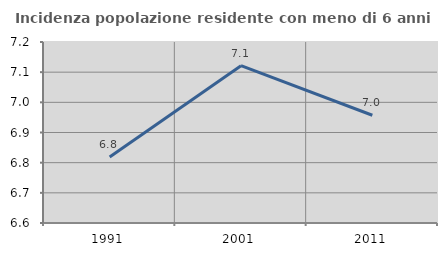
| Category | Incidenza popolazione residente con meno di 6 anni |
|---|---|
| 1991.0 | 6.819 |
| 2001.0 | 7.122 |
| 2011.0 | 6.957 |